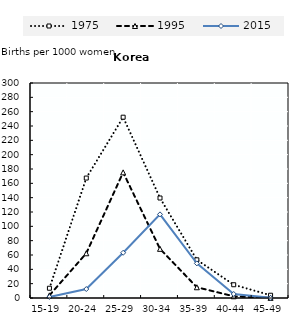
| Category | 1975 | 1995 | 2015 |
|---|---|---|---|
| 15-19 | 13.625 | 3.7 | 1.4 |
| 20-24 | 167.368 | 62.4 | 12.5 |
| 25-29 | 252.278 | 175.3 | 63.1 |
| 30-34 | 139.525 | 68.6 | 116.7 |
| 35-39 | 53.299 | 15 | 48.3 |
| 40-44 | 18.495 | 2.4 | 5.6 |
| 45-49 | 3.844 | 0.2 | 0.2 |